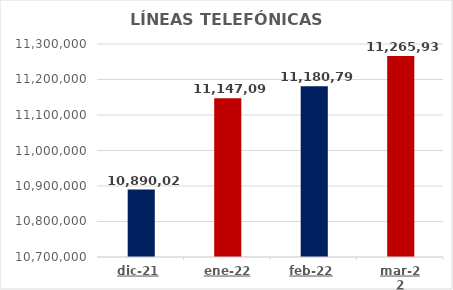
| Category | LÍNEAS TELEFÓNICAS TOTALES |
|---|---|
| 2021-12-01 | 10890021.005 |
| 2022-01-01 | 11147096.007 |
| 2022-02-01 | 11180794.006 |
| 2022-03-01 | 11265936.998 |